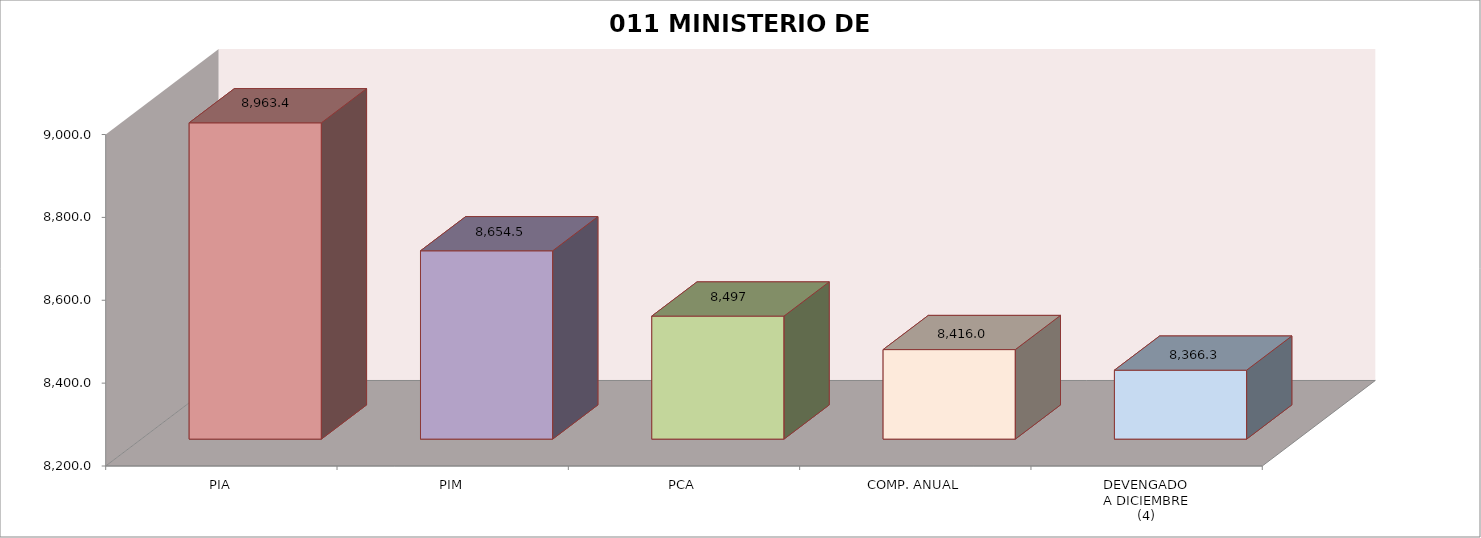
| Category | 011 MINISTERIO DE SALUD |
|---|---|
| PIA | 8963.39 |
| PIM | 8654.488 |
| PCA | 8496.898 |
| COMP. ANUAL | 8416.044 |
| DEVENGADO
A DICIEMBRE
(4) | 8366.339 |